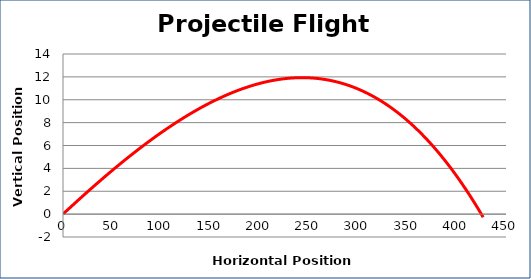
| Category | Projectile Flight Path |
|---|---|
| 0.0 | 0 |
| 1.1986510853940044 | 0.096 |
| 2.3946660396285355 | 0.191 |
| 3.5880615046633038 | 0.286 |
| 4.778853947998538 | 0.381 |
| 5.967059665226714 | 0.475 |
| 7.15269478253646 | 0.569 |
| 8.335775259169747 | 0.663 |
| 9.516316889833398 | 0.756 |
| 10.694335307065979 | 0.848 |
| 11.86984598356106 | 0.941 |
| 13.042864234447826 | 1.033 |
| 14.213405219530012 | 1.124 |
| 15.381483945484044 | 1.215 |
| 16.547115268017347 | 1.306 |
| 17.710313893987664 | 1.397 |
| 18.87109438348424 | 1.487 |
| 20.029471151871757 | 1.576 |
| 21.185458471797727 | 1.665 |
| 22.33907047516429 | 1.754 |
| 23.490321155065025 | 1.843 |
| 24.639224367687657 | 1.931 |
| 25.785793834183313 | 2.019 |
| 26.930043142503106 | 2.106 |
| 28.071985749202657 | 2.193 |
| 29.21163498121533 | 2.279 |
| 30.349004037594785 | 2.365 |
| 31.48410599122753 | 2.451 |
| 32.61695379051602 | 2.537 |
| 33.74756026103306 | 2.622 |
| 34.87593810714796 | 2.706 |
| 36.002099913625166 | 2.79 |
| 37.126058147195785 | 2.874 |
| 38.24782515810274 | 2.958 |
| 39.36741318161991 | 3.041 |
| 40.48483433954595 | 3.123 |
| 41.600100641673166 | 3.206 |
| 42.71322398723212 | 3.288 |
| 43.82421616631224 | 3.369 |
| 44.93308886125908 | 3.45 |
| 46.03985364804869 | 3.531 |
| 47.144521997639494 | 3.611 |
| 48.24710527730206 | 3.691 |
| 49.34761475192746 | 3.771 |
| 50.44606158531429 | 3.85 |
| 51.542456841435076 | 3.929 |
| 52.63681148568226 | 4.007 |
| 53.729136386094346 | 4.085 |
| 54.81944231456238 | 4.163 |
| 55.907739948017365 | 4.24 |
| 56.99403986959882 | 4.317 |
| 58.07835256980493 | 4.394 |
| 59.160688447624594 | 4.47 |
| 60.241057811651764 | 4.545 |
| 61.31947088118239 | 4.621 |
| 62.395937787294265 | 4.696 |
| 63.47046857391017 | 4.77 |
| 64.54307319884457 | 4.845 |
| 65.61376153483421 | 4.918 |
| 66.68254337055286 | 4.992 |
| 67.74942841161067 | 5.065 |
| 68.81442628153805 | 5.137 |
| 69.87754652275487 | 5.21 |
| 70.93879859752482 | 5.281 |
| 71.99819188889548 | 5.353 |
| 73.05573570162414 | 5.424 |
| 74.11143926308988 | 5.495 |
| 75.16531172419187 | 5.565 |
| 76.21736216023446 | 5.635 |
| 77.26759957179905 | 5.705 |
| 78.3160328856031 | 5.774 |
| 79.36267095534632 | 5.842 |
| 80.40752256254486 | 5.911 |
| 81.45059641735256 | 5.979 |
| 82.4919011593713 | 6.046 |
| 83.53144535844825 | 6.114 |
| 84.56923751546226 | 6.181 |
| 85.6052860630996 | 6.247 |
| 86.63959936661686 | 6.313 |
| 87.67218572459426 | 6.379 |
| 88.7030533696776 | 6.444 |
| 89.7322104693098 | 6.509 |
| 90.75966512645189 | 6.573 |
| 91.78542538029389 | 6.638 |
| 92.80949920695565 | 6.701 |
| 93.83189452017767 | 6.765 |
| 94.85261917200239 | 6.828 |
| 95.87168095344587 | 6.89 |
| 96.88908759516003 | 6.952 |
| 97.90484676808578 | 7.014 |
| 98.91896608409705 | 7.076 |
| 99.93145309663585 | 7.137 |
| 100.94231530133871 | 7.197 |
| 101.95156013665431 | 7.258 |
| 102.95919498445289 | 7.318 |
| 103.9652271706271 | 7.377 |
| 104.96966396568484 | 7.436 |
| 105.97251258533396 | 7.495 |
| 106.97378019105903 | 7.553 |
| 107.97347389069039 | 7.611 |
| 108.97160073896555 | 7.669 |
| 109.96816773808307 | 7.726 |
| 110.9631818382485 | 7.783 |
| 111.9566499382143 | 7.839 |
| 112.94857888581127 | 7.895 |
| 113.93897547847358 | 7.951 |
| 114.92784646375672 | 8.006 |
| 115.91519853984872 | 8.061 |
| 116.90103835607447 | 8.115 |
| 117.8853725133936 | 8.17 |
| 118.86820756489178 | 8.223 |
| 119.84955001626562 | 8.277 |
| 120.82940632630127 | 8.329 |
| 121.80778290734682 | 8.382 |
| 122.78468612577866 | 8.434 |
| 123.76012230246172 | 8.486 |
| 124.73409771320391 | 8.537 |
| 125.70661858920464 | 8.588 |
| 126.67769111749766 | 8.639 |
| 127.6473214413884 | 8.689 |
| 128.61551566088545 | 8.739 |
| 129.5822798331268 | 8.789 |
| 130.54761997280067 | 8.838 |
| 131.51154205256108 | 8.886 |
| 132.47405200343803 | 8.935 |
| 133.43515571524267 | 8.982 |
| 134.39485903696755 | 9.03 |
| 135.35316777718148 | 9.077 |
| 136.31008770442 | 9.124 |
| 137.26562454757055 | 9.17 |
| 138.2197839962532 | 9.216 |
| 139.17257170119663 | 9.262 |
| 140.1239932746093 | 9.307 |
| 141.0740542905463 | 9.352 |
| 142.02276028527172 | 9.396 |
| 142.97011675761635 | 9.44 |
| 143.9161291693314 | 9.484 |
| 144.86080294543757 | 9.527 |
| 145.80414347457025 | 9.57 |
| 146.74615610932017 | 9.613 |
| 147.68684616657046 | 9.655 |
| 148.6262189278291 | 9.697 |
| 149.5642796395579 | 9.738 |
| 150.5010335134972 | 9.779 |
| 151.43648572698694 | 9.819 |
| 152.37064142328376 | 9.86 |
| 153.30350571187444 | 9.899 |
| 154.23508366878565 | 9.939 |
| 155.16538033689005 | 9.978 |
| 156.0944007262087 | 10.017 |
| 157.02214981421002 | 10.055 |
| 157.94863254610533 | 10.093 |
| 158.8738538351408 | 10.13 |
| 159.79781856288605 | 10.167 |
| 160.7205315795195 | 10.204 |
| 161.64199770411028 | 10.24 |
| 162.56222172489706 | 10.276 |
| 163.4812083995635 | 10.312 |
| 164.39896245551068 | 10.347 |
| 165.31548859012634 | 10.382 |
| 166.23079147105094 | 10.416 |
| 167.14487573644112 | 10.45 |
| 168.05774599522957 | 10.484 |
| 168.9694068273824 | 10.517 |
| 169.87986278415343 | 10.55 |
| 170.78911838833568 | 10.582 |
| 171.69717813450998 | 10.614 |
| 172.60404648929074 | 10.646 |
| 173.50972789156918 | 10.677 |
| 174.41422675275365 | 10.708 |
| 175.31754745700727 | 10.739 |
| 176.2196943614832 | 10.769 |
| 177.1206717965568 | 10.799 |
| 178.02048406605593 | 10.828 |
| 178.91913544748797 | 10.857 |
| 179.81663019226488 | 10.886 |
| 180.71297252592552 | 10.914 |
| 181.6081666483557 | 10.942 |
| 182.50221673400577 | 10.969 |
| 183.39512693210565 | 10.996 |
| 184.28690136687797 | 11.023 |
| 185.1775441377484 | 11.049 |
| 186.0670593195541 | 11.075 |
| 186.95545096274967 | 11.101 |
| 187.84272309361106 | 11.126 |
| 188.72887971443714 | 11.151 |
| 189.61392480374926 | 11.175 |
| 190.4978623164885 | 11.199 |
| 191.3806961842111 | 11.222 |
| 192.26243031528148 | 11.246 |
| 193.1430685950634 | 11.268 |
| 194.02261488610918 | 11.291 |
| 194.9010730283467 | 11.313 |
| 195.77844683926463 | 11.335 |
| 196.65474011409555 | 11.356 |
| 197.52995662599727 | 11.377 |
| 198.40410012623227 | 11.397 |
| 199.27717434434518 | 11.417 |
| 200.1491829883385 | 11.437 |
| 201.0201297448463 | 11.456 |
| 201.8900182793064 | 11.475 |
| 202.75885223613065 | 11.494 |
| 203.62663523887346 | 11.512 |
| 204.49337089039838 | 11.53 |
| 205.35906277304346 | 11.547 |
| 206.22371444878448 | 11.564 |
| 207.0873294593966 | 11.581 |
| 207.94991132661465 | 11.597 |
| 208.8114635522913 | 11.613 |
| 209.671989618554 | 11.628 |
| 210.53149298796035 | 11.644 |
| 211.3899771036516 | 11.658 |
| 212.24744538950486 | 11.673 |
| 213.10390125028366 | 11.686 |
| 213.95934807178708 | 11.7 |
| 214.81378922099725 | 11.713 |
| 215.66722804622566 | 11.726 |
| 216.5196678772576 | 11.738 |
| 217.3711120254955 | 11.75 |
| 218.2215637841008 | 11.762 |
| 219.0710264281342 | 11.773 |
| 219.91950321469474 | 11.784 |
| 220.76699738305754 | 11.794 |
| 221.61351215480985 | 11.804 |
| 222.45905073398637 | 11.814 |
| 223.3036163072025 | 11.823 |
| 224.14721204378685 | 11.832 |
| 224.9898410959124 | 11.841 |
| 225.83150659872598 | 11.849 |
| 226.67221167047688 | 11.857 |
| 227.51195941264433 | 11.864 |
| 228.35075291006322 | 11.871 |
| 229.18859523104902 | 11.878 |
| 230.02548942752142 | 11.884 |
| 230.8614385351268 | 11.89 |
| 231.69644557335934 | 11.895 |
| 232.5305135456812 | 11.9 |
| 233.36364543964152 | 11.905 |
| 234.1958442269941 | 11.909 |
| 235.0271128638142 | 11.913 |
| 235.8574542906141 | 11.916 |
| 236.68687143245748 | 11.92 |
| 237.51536719907307 | 11.922 |
| 238.3429444849668 | 11.925 |
| 239.16960616953318 | 11.927 |
| 239.99535511716545 | 11.928 |
| 240.82019417736493 | 11.929 |
| 241.64412618484906 | 11.93 |
| 242.4671539596587 | 11.931 |
| 243.2892803072643 | 11.931 |
| 244.11050801867106 | 11.93 |
| 244.93083987052302 | 11.929 |
| 245.75027862520673 | 11.928 |
| 246.56882703095306 | 11.927 |
| 247.38648782193894 | 11.925 |
| 248.20326371838755 | 11.923 |
| 249.01915742666802 | 11.92 |
| 249.83417163939396 | 11.917 |
| 250.64830903552107 | 11.913 |
| 251.46157228044405 | 11.91 |
| 252.27396402609259 | 11.905 |
| 253.08548691102627 | 11.901 |
| 253.89614356052883 | 11.896 |
| 254.70593658670148 | 11.89 |
| 255.5148685885556 | 11.885 |
| 256.3229421521042 | 11.878 |
| 257.1301598504526 | 11.872 |
| 257.93652424388915 | 11.865 |
| 258.74203787997345 | 11.858 |
| 259.54670329362574 | 11.85 |
| 260.35052300721384 | 11.842 |
| 261.15349953064043 | 11.833 |
| 261.955635361429 | 11.824 |
| 262.7569329848091 | 11.815 |
| 263.55739487380106 | 11.806 |
| 264.3570234892996 | 11.796 |
| 265.1558212801572 | 11.785 |
| 265.9537906832663 | 11.774 |
| 266.75093412364066 | 11.763 |
| 267.54725401449696 | 11.752 |
| 268.3427527573343 | 11.74 |
| 269.13743274201425 | 11.727 |
| 269.93129634683913 | 11.715 |
| 270.7243459386307 | 11.702 |
| 271.51658387280713 | 11.688 |
| 272.3080124934603 | 11.674 |
| 273.09863413343123 | 11.66 |
| 273.8884511143863 | 11.645 |
| 274.67746574689147 | 11.63 |
| 275.46568033048675 | 11.615 |
| 276.2530971537597 | 11.599 |
| 277.03971849441814 | 11.583 |
| 277.8255466193628 | 11.566 |
| 278.61058378475866 | 11.549 |
| 279.39483223610614 | 11.532 |
| 280.1782942083115 | 11.514 |
| 280.9609719257567 | 11.496 |
| 281.74286760236873 | 11.477 |
| 282.52398344168824 | 11.459 |
| 283.3043216369377 | 11.439 |
| 284.0838843710887 | 11.42 |
| 284.86267381692926 | 11.4 |
| 285.6406921371299 | 11.379 |
| 286.4179414843098 | 11.358 |
| 287.19442400110165 | 11.337 |
| 287.9701418202169 | 11.315 |
| 288.7450970645096 | 11.293 |
| 289.5192918470403 | 11.271 |
| 290.29272827113897 | 11.248 |
| 291.06540843046787 | 11.225 |
| 291.8373344090835 | 11.202 |
| 292.6085082814982 | 11.178 |
| 293.3789321127413 | 11.153 |
| 294.1486079584198 | 11.129 |
| 294.9175378647781 | 11.104 |
| 295.685723868758 | 11.078 |
| 296.45316799805755 | 11.052 |
| 297.2198722711899 | 11.026 |
| 297.98583869754117 | 10.999 |
| 298.7510692774284 | 10.972 |
| 299.5155660021567 | 10.945 |
| 300.27933085407557 | 10.917 |
| 301.04236580663604 | 10.889 |
| 301.8046728244456 | 10.861 |
| 302.5662538633244 | 10.832 |
| 303.3271108703595 | 10.802 |
| 304.08724578395976 | 10.773 |
| 304.84666053390964 | 10.742 |
| 305.6053570414233 | 10.712 |
| 306.3633372191973 | 10.681 |
| 307.12060297146354 | 10.65 |
| 307.87715619404173 | 10.618 |
| 308.6329987743912 | 10.586 |
| 309.38813259166244 | 10.554 |
| 310.1425595167484 | 10.521 |
| 310.8962814123349 | 10.488 |
| 311.6493001329512 | 10.454 |
| 312.40161752501984 | 10.42 |
| 313.1532354269062 | 10.386 |
| 313.90415566896746 | 10.351 |
| 314.6543800736017 | 10.316 |
| 315.40391045529594 | 10.28 |
| 316.1527486206743 | 10.245 |
| 316.9008963685456 | 10.208 |
| 317.64835548995075 | 10.172 |
| 318.3951277682094 | 10.135 |
| 319.1412149789665 | 10.097 |
| 319.8866188902387 | 10.059 |
| 320.6313412624598 | 10.021 |
| 321.37538384852655 | 9.983 |
| 322.11874839384353 | 9.944 |
| 322.86143663636807 | 9.904 |
| 323.6034503066544 | 9.864 |
| 324.3447911278981 | 9.824 |
| 325.08546081597945 | 9.784 |
| 325.8254610795072 | 9.743 |
| 326.5647936198613 | 9.702 |
| 327.30346013123597 | 9.66 |
| 328.0414623006818 | 9.618 |
| 328.7788018081482 | 9.575 |
| 329.5154803265248 | 9.532 |
| 330.25149952168323 | 9.489 |
| 330.9868610525182 | 9.446 |
| 331.7215665709881 | 9.402 |
| 332.4556177221559 | 9.357 |
| 333.18901614422924 | 9.312 |
| 333.9217634686003 | 9.267 |
| 334.65386131988544 | 9.222 |
| 335.38531131596454 | 9.176 |
| 336.1161150680201 | 9.13 |
| 336.8462741805761 | 9.083 |
| 337.575790251536 | 9.036 |
| 338.30466487222157 | 8.988 |
| 339.0328996274104 | 8.94 |
| 339.76049609537347 | 8.892 |
| 340.48745584791266 | 8.844 |
| 341.2137804503978 | 8.794 |
| 341.93947146180335 | 8.745 |
| 342.664530434745 | 8.695 |
| 343.38895891551607 | 8.645 |
| 344.1127584441231 | 8.595 |
| 344.83593055432186 | 8.544 |
| 345.5584767736529 | 8.492 |
| 346.2803986234767 | 8.441 |
| 347.00169761900816 | 8.388 |
| 347.7223752693522 | 8.336 |
| 348.44243307753726 | 8.283 |
| 349.1618725405501 | 8.23 |
| 349.8806951493697 | 8.176 |
| 350.5989023890006 | 8.122 |
| 351.3164957385067 | 8.068 |
| 352.0334766710445 | 8.013 |
| 352.74984665389576 | 7.958 |
| 353.4656071485005 | 7.902 |
| 354.1807596104896 | 7.846 |
| 354.8953054897168 | 7.79 |
| 355.60924623029086 | 7.733 |
| 356.3225832706076 | 7.676 |
| 357.03531804338104 | 7.618 |
| 357.74745197567523 | 7.561 |
| 358.4589864889351 | 7.502 |
| 359.16992299901756 | 7.444 |
| 359.88026291622197 | 7.385 |
| 360.590007645321 | 7.325 |
| 361.29915858559065 | 7.265 |
| 362.0077171308402 | 7.205 |
| 362.71568466944245 | 7.144 |
| 363.42306258436304 | 7.083 |
| 364.12985225318994 | 7.022 |
| 364.83605504816285 | 6.96 |
| 365.541672336202 | 6.898 |
| 366.2467054789371 | 6.836 |
| 366.951155832736 | 6.773 |
| 367.65502474873296 | 6.709 |
| 368.35831357285707 | 6.646 |
| 369.06102364586013 | 6.582 |
| 369.76315630334454 | 6.517 |
| 370.464712875791 | 6.452 |
| 371.16569468858586 | 6.387 |
| 371.86610306204847 | 6.322 |
| 372.5659393114582 | 6.256 |
| 373.26520474708144 | 6.189 |
| 373.96390067419816 | 6.122 |
| 374.66202839312854 | 6.055 |
| 375.3595891992593 | 5.988 |
| 376.0565843830698 | 5.92 |
| 376.75301523015804 | 5.851 |
| 377.44888302126674 | 5.783 |
| 378.1441890323084 | 5.714 |
| 378.8389345343914 | 5.644 |
| 379.53312079384483 | 5.574 |
| 380.2267490722439 | 5.504 |
| 380.9198206264346 | 5.433 |
| 381.6123367085587 | 5.362 |
| 382.30429856607844 | 5.291 |
| 382.9957074418007 | 5.219 |
| 383.68656457390136 | 5.147 |
| 384.3768711959497 | 5.075 |
| 385.0666285369321 | 5.002 |
| 385.75583782127575 | 4.928 |
| 386.4445002688725 | 4.855 |
| 387.13261709510243 | 4.78 |
| 387.82018951085684 | 4.706 |
| 388.50721872256156 | 4.631 |
| 389.1937059322003 | 4.556 |
| 389.87965233733706 | 4.48 |
| 390.565059131139 | 4.404 |
| 391.24992750239903 | 4.328 |
| 391.93425863555836 | 4.251 |
| 392.6180537107285 | 4.174 |
| 393.30131390371355 | 4.096 |
| 393.9840403860322 | 4.018 |
| 394.66623432493947 | 3.94 |
| 395.34789688344847 | 3.861 |
| 396.02902922035196 | 3.782 |
| 396.7096324902437 | 3.703 |
| 397.38970784353967 | 3.623 |
| 398.0692564264994 | 3.542 |
| 398.74827938124685 | 3.462 |
| 399.42677784579104 | 3.381 |
| 400.1047529540474 | 3.299 |
| 400.78220583585755 | 3.217 |
| 401.45913761701036 | 3.135 |
| 402.135549419262 | 3.053 |
| 402.8114423603564 | 2.97 |
| 403.4868175540449 | 2.886 |
| 404.1616761101065 | 2.803 |
| 404.8360191343675 | 2.718 |
| 405.50984772872135 | 2.634 |
| 406.18316299114815 | 2.549 |
| 406.8559660157339 | 2.464 |
| 407.52825789268996 | 2.378 |
| 408.2000397083724 | 2.292 |
| 408.87131254530067 | 2.206 |
| 409.54207748217686 | 2.119 |
| 410.21233559390436 | 2.031 |
| 410.88208795160665 | 1.944 |
| 411.55133562264575 | 1.856 |
| 412.22007967064087 | 1.768 |
| 412.88832115548666 | 1.679 |
| 413.55606113337143 | 1.59 |
| 414.2233006567953 | 1.5 |
| 414.8900407745881 | 1.41 |
| 415.55628253192754 | 1.32 |
| 416.2220269703565 | 1.229 |
| 416.88727512780144 | 1.138 |
| 417.5520280385891 | 1.047 |
| 418.2162867334647 | 0.955 |
| 418.8800522396087 | 0.863 |
| 419.54332558065437 | 0.77 |
| 420.20610777670487 | 0.677 |
| 420.8683998443502 | 0.584 |
| 421.5302027966842 | 0.49 |
| 422.1915176433211 | 0.396 |
| 422.85234539041284 | 0.301 |
| 423.51268704066473 | 0.206 |
| 424.1725435933529 | 0.111 |
| 424.8319160443401 | 0.015 |
| 425.49080538609223 | -0.081 |
| 426.14921260769455 | -0.177 |
| 426.8071386948675 | -0.274 |